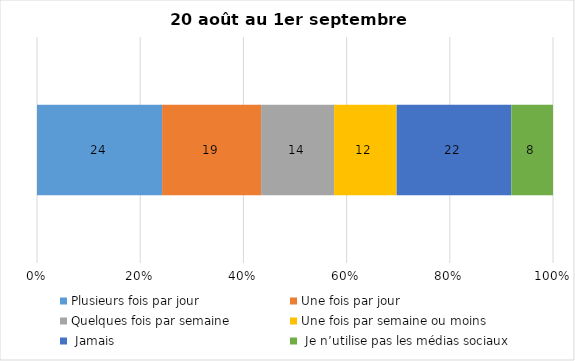
| Category | Plusieurs fois par jour | Une fois par jour | Quelques fois par semaine   | Une fois par semaine ou moins   |  Jamais   |  Je n’utilise pas les médias sociaux |
|---|---|---|---|---|---|---|
| 0 | 24 | 19 | 14 | 12 | 22 | 8 |